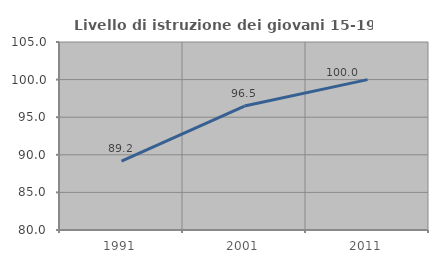
| Category | Livello di istruzione dei giovani 15-19 anni |
|---|---|
| 1991.0 | 89.167 |
| 2001.0 | 96.484 |
| 2011.0 | 100 |